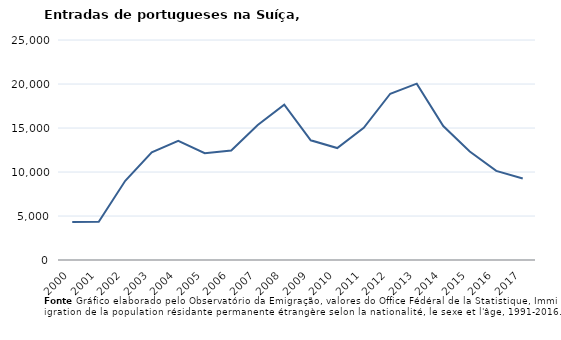
| Category | Entradas |
|---|---|
| 2000.0 | 4311 |
| 2001.0 | 4347 |
| 2002.0 | 9005 |
| 2003.0 | 12228 |
| 2004.0 | 13539 |
| 2005.0 | 12138 |
| 2006.0 | 12441 |
| 2007.0 | 15351 |
| 2008.0 | 17657 |
| 2009.0 | 13601 |
| 2010.0 | 12720 |
| 2011.0 | 15020 |
| 2012.0 | 18892 |
| 2013.0 | 20039 |
| 2014.0 | 15221 |
| 2015.0 | 12325 |
| 2016.0 | 10123 |
| 2017.0 | 9257 |